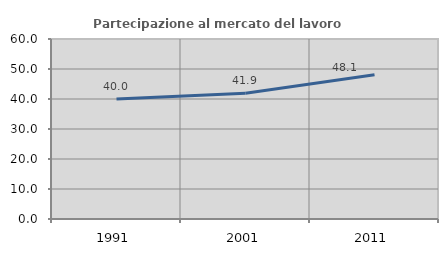
| Category | Partecipazione al mercato del lavoro  femminile |
|---|---|
| 1991.0 | 39.974 |
| 2001.0 | 41.943 |
| 2011.0 | 48.051 |